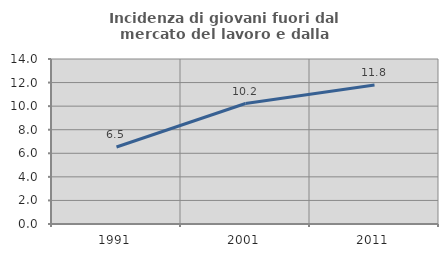
| Category | Incidenza di giovani fuori dal mercato del lavoro e dalla formazione  |
|---|---|
| 1991.0 | 6.534 |
| 2001.0 | 10.222 |
| 2011.0 | 11.8 |